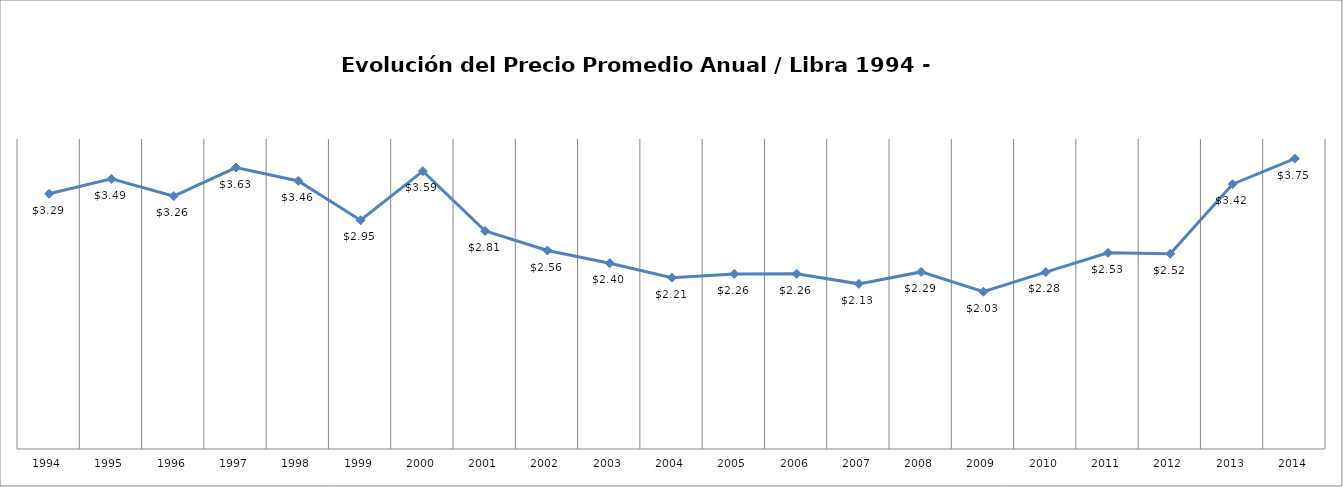
| Category | Series 0 |
|---|---|
| 1994.0 | 3.293 |
| 1995.0 | 3.485 |
| 1996.0 | 3.264 |
| 1997.0 | 3.632 |
| 1998.0 | 3.459 |
| 1999.0 | 2.951 |
| 2000.0 | 3.585 |
| 2001.0 | 2.813 |
| 2002.0 | 2.561 |
| 2003.0 | 2.397 |
| 2004.0 | 2.21 |
| 2005.0 | 2.259 |
| 2006.0 | 2.261 |
| 2007.0 | 2.131 |
| 2008.0 | 2.285 |
| 2009.0 | 2.029 |
| 2010.0 | 2.282 |
| 2011.0 | 2.531 |
| 2012.0 | 2.52 |
| 2013.0 | 3.417 |
| 2014.0 | 3.747 |